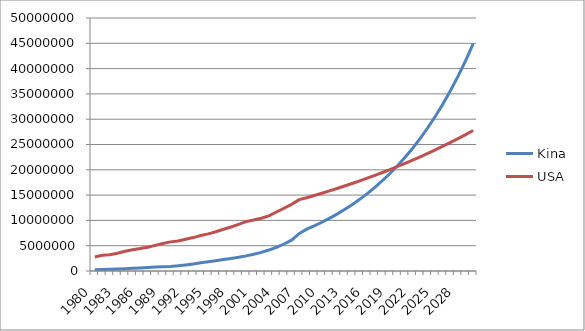
| Category | Kina | USA |
|---|---|---|
| 1980.0 | 246779 | 2768900 |
| 1981.0 | 283996 | 3105400 |
| 1982.0 | 328711 | 3229500 |
| 1983.0 | 378957 | 3508800 |
| 1984.0 | 452951 | 3902600 |
| 1985.0 | 529880 | 4187500 |
| 1986.0 | 589362 | 4427700 |
| 1987.0 | 675888 | 4702100 |
| 1988.0 | 778067 | 5063900 |
| 1989.0 | 840702 | 5441700 |
| 1990.0 | 906401 | 5757200 |
| 1991.0 | 1024393 | 5946900 |
| 1992.0 | 1196795 | 6286800 |
| 1993.0 | 1395692 | 6604300 |
| 1994.0 | 1611819 | 7017500 |
| 1995.0 | 1823959 | 7342300 |
| 1996.0 | 2044551 | 7762300 |
| 1997.0 | 2272021 | 8250900 |
| 1998.0 | 2476451 | 8694600 |
| 1999.0 | 2703164 | 9216200 |
| 2000.0 | 2994105 | 9764800 |
| 2001.0 | 3320724 | 10075900 |
| 2002.0 | 3686312 | 10417600 |
| 2003.0 | 4141356 | 10908000 |
| 2004.0 | 4688989 | 11657300 |
| 2005.0 | 5333233 | 12397900 |
| 2006.0 | 6091977 | 13163870 |
| 2007.0 | 7386000 | 14102000 |
| 2008.0 | 8263000 | 14488000 |
| 2009.0 | 8924040 | 14922640 |
| 2010.0 | 9637963.2 | 15370319.2 |
| 2011.0 | 10409000.256 | 15831428.776 |
| 2012.0 | 11241720.276 | 16306371.639 |
| 2013.0 | 12141057.899 | 16795562.788 |
| 2014.0 | 13112342.53 | 17299429.672 |
| 2015.0 | 14161329.933 | 17818412.562 |
| 2016.0 | 15294236.328 | 18352964.939 |
| 2017.0 | 16517775.234 | 18903553.887 |
| 2018.0 | 17839197.252 | 19470660.504 |
| 2019.0 | 19266333.033 | 20054780.319 |
| 2020.0 | 20807639.675 | 20656423.729 |
| 2021.0 | 22472250.849 | 21276116.44 |
| 2022.0 | 24270030.917 | 21914399.934 |
| 2023.0 | 26211633.391 | 22571831.932 |
| 2024.0 | 28308564.062 | 23248986.89 |
| 2025.0 | 30573249.187 | 23946456.496 |
| 2026.0 | 33019109.122 | 24664850.191 |
| 2027.0 | 35660637.852 | 25404795.697 |
| 2028.0 | 38513488.88 | 26166939.568 |
| 2029.0 | 41594567.99 | 26951947.755 |
| 2030.0 | 44922133.429 | 27760506.188 |